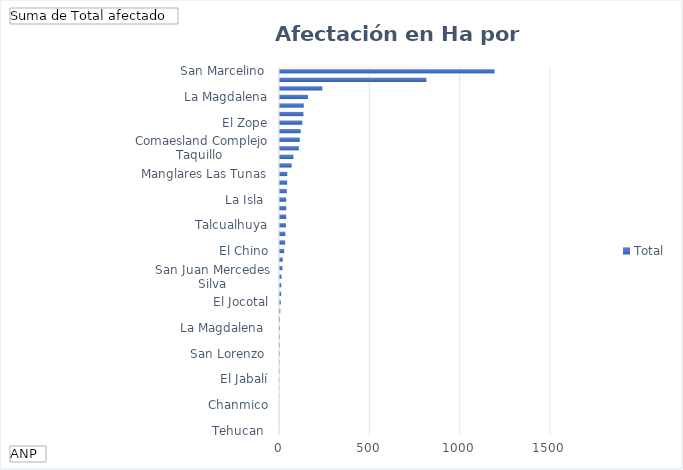
| Category | Total |
|---|---|
| Tehucan  | 0.324 |
|  Santa Marta Las Trincheras, Compljeo Los Farallones | 0.35 |
| Chanmico | 0.5 |
| Barra de Santiago  | 1.2 |
| La  Joya | 1.39 |
| El Jabalí | 1.5 |
| El Caballito | 2 |
| Crater del Volcan de San Salvador  | 2.35 |
| San Lorenzo  | 2.8 |
| Santa Marta Las Trincheras, Complejo Los Farallones | 4 |
| La Magdalena  | 4 |
|  Las Victorias, Complejo Los Farallones | 4.47 |
|  El Jocotal | 5 |
| Montecristo | 5.25 |
| Cerro El Negro  | 7.05 |
| San Juan Mercedes Silva | 10 |
| Escuintla | 12 |
| Colima | 12.854 |
| El Chino | 14 |
| Socorro  Complejo Taquillo  | 19 |
| Las   Nieves   | 20.85 |
| Talcualhuya | 28.75 |
| San Andres  | 34 |
| El Imposible | 35 |
| La Isla  | 38.4 |
| Manglares Icacal | 40 |
|  Olomega | 40 |
| Manglares Las Tunas | 40 |
| El Mirador  | 43.4 |
| Manglar golfo de Fonseca | 45 |
| Comaesland Complejo Taquillo  | 46 |
| Gualpirque | 70 |
| Santa Águeda, El Zope, Complejo Los Cóbanos | 80 |
| Tierra Blanca | 110 |
| La Magdalena | 115 |
| Lavas del Volcan Chaparrastique sur | 120 |
| Las Moritas | 129 |
| San Marcelino  | 135.419 |
| Piedras tontas el Paisnal | 137 |
|  San lucas o Palo galan | 160 |
|  El Socorro | 240 |
| La Pupusa | 816 |
| Chilanguera | 1193 |